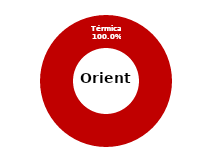
| Category | Oriente |
|---|---|
| Eólica | 0 |
| Hidráulica | 0 |
| Solar | 0 |
| Térmica | 34.28 |